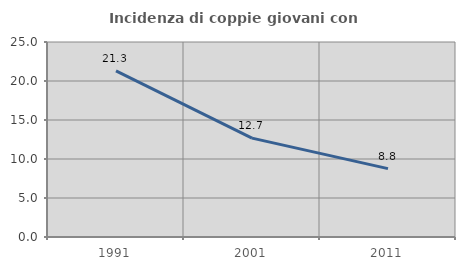
| Category | Incidenza di coppie giovani con figli |
|---|---|
| 1991.0 | 21.29 |
| 2001.0 | 12.677 |
| 2011.0 | 8.764 |